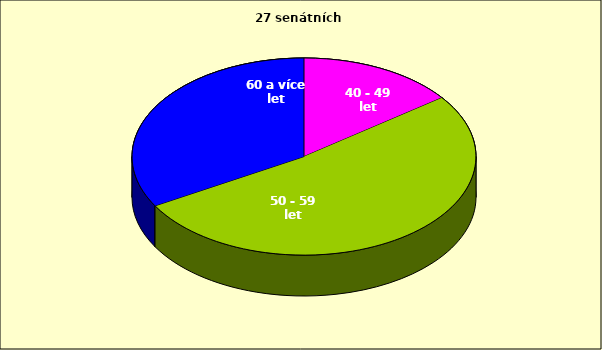
| Category | Series 0 |
|---|---|
| 40 - 49 let | 4 |
| 50 - 59 let | 14 |
| 60 a více let | 9 |